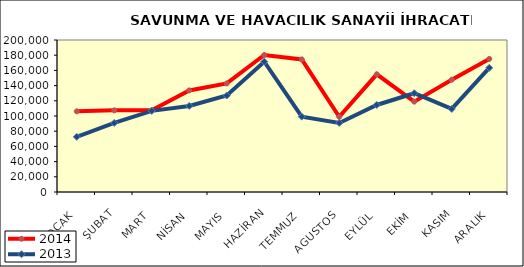
| Category | 2014 | 2013 |
|---|---|---|
| OCAK | 106122.356 | 72558.026 |
| ŞUBAT | 107443.261 | 90844.455 |
| MART | 107438.487 | 106723.235 |
| NİSAN | 133668.089 | 113262.235 |
| MAYIS | 142827.799 | 126939.528 |
| HAZİRAN | 180261.736 | 171486.938 |
| TEMMUZ | 174457.046 | 99144.585 |
| AGUSTOS | 98979.868 | 90827.187 |
| EYLÜL | 154855.013 | 114505.418 |
| EKİM | 118892.019 | 129968.928 |
| KASIM | 147785.284 | 109259.065 |
| ARALIK | 175131.81 | 163409.96 |